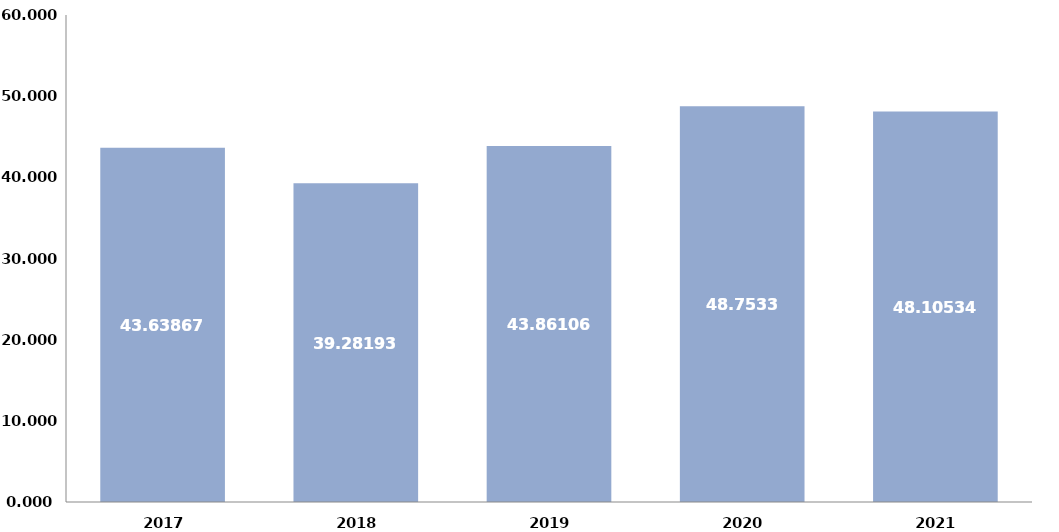
| Category | Series 1 |
|---|---|
| 2017.0 | 43638677 |
| 2018.0 | 39281939 |
| 2019.0 | 43861068 |
| 2020.0 | 48753320 |
| 2021.0 | 48105344 |